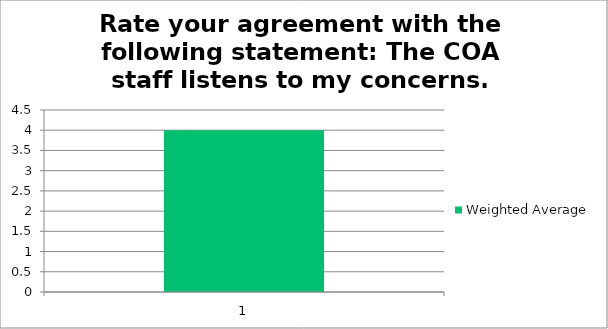
| Category | Weighted Average |
|---|---|
| 1.0 | 4 |